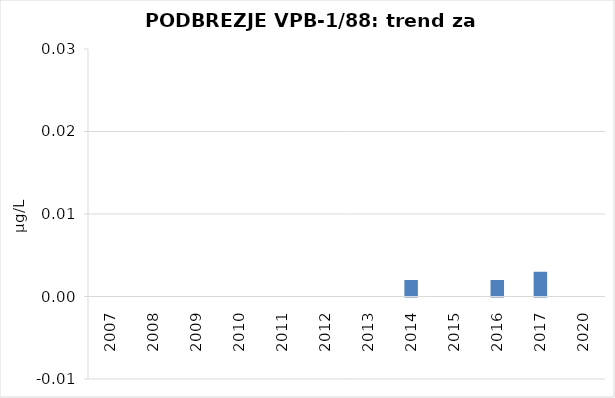
| Category | Vsota |
|---|---|
| 2007 | 0 |
| 2008 | 0 |
| 2009 | 0 |
| 2010 | 0 |
| 2011 | 0 |
| 2012 | 0 |
| 2013 | 0 |
| 2014 | 0.002 |
| 2015 | 0 |
| 2016 | 0.002 |
| 2017 | 0.003 |
| 2020 | 0 |